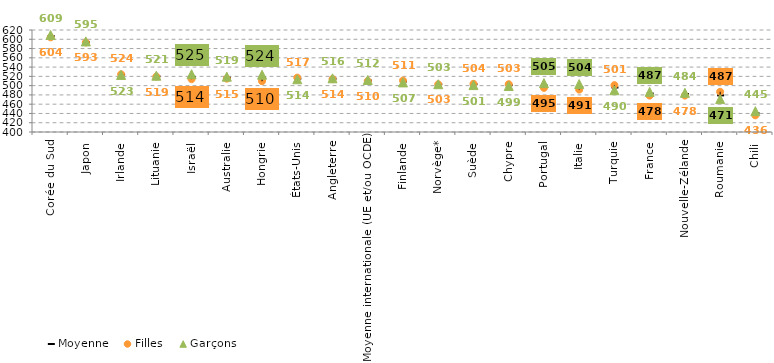
| Category | Moyenne | Filles | Garçons |
|---|---|---|---|
| Corée du Sud | 607 | 604.175 | 609.28 |
| Japon | 594 | 593.131 | 595.412 |
| Irlande | 524 | 524.416 | 523.078 |
| Lituanie | 520 | 519.438 | 521.441 |
| Israël | 519 | 513.972 | 524.633 |
| Australie | 517 | 515.113 | 519.397 |
| Hongrie | 517 | 509.533 | 523.61 |
| États-Unis | 515 | 517.265 | 513.718 |
| Angleterre | 515 | 514.161 | 515.791 |
| Moyenne internationale (UE et/ou OCDE) | 511 | 509.975 | 512.128 |
| Finlande | 509 | 511.011 | 506.951 |
| Norvège* | 503 | 502.895 | 503.072 |
| Suède | 503 | 503.953 | 501.145 |
| Chypre | 501 | 503.1 | 499.116 |
| Portugal | 500 | 495.15 | 505.476 |
| Italie | 497 | 491.373 | 503.508 |
| Turquie | 496 | 501.108 | 490.055 |
| France | 483 | 478.435 | 486.558 |
| Nouvelle-Zélande | 482 | 478.488 | 484.483 |
| Roumanie | 479 | 486.812 | 470.929 |
| Chili | 441 | 435.969 | 444.913 |